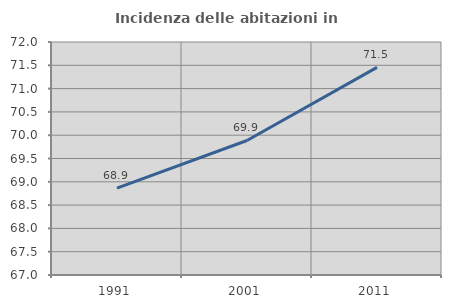
| Category | Incidenza delle abitazioni in proprietà  |
|---|---|
| 1991.0 | 68.863 |
| 2001.0 | 69.887 |
| 2011.0 | 71.456 |